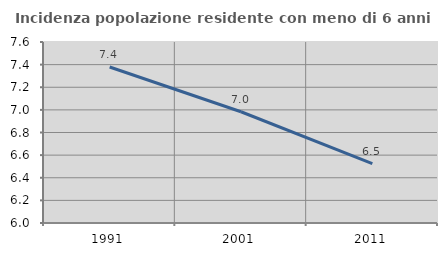
| Category | Incidenza popolazione residente con meno di 6 anni |
|---|---|
| 1991.0 | 7.379 |
| 2001.0 | 6.983 |
| 2011.0 | 6.526 |